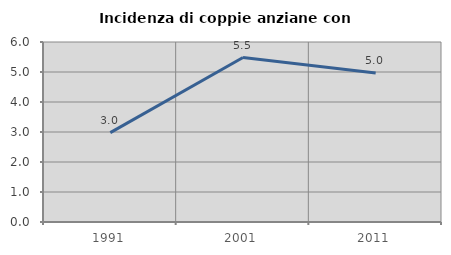
| Category | Incidenza di coppie anziane con figli |
|---|---|
| 1991.0 | 2.977 |
| 2001.0 | 5.481 |
| 2011.0 | 4.965 |